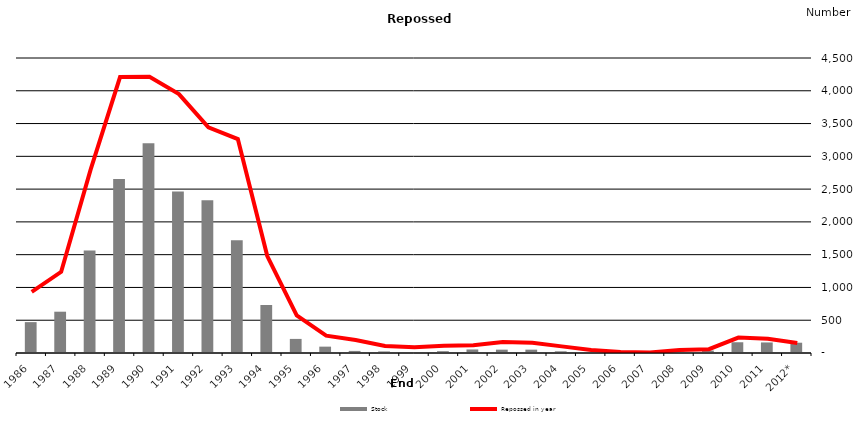
| Category | Stock |
|---|---|
| 1986  | 471 |
| 1987  | 630 |
| 1988  | 1562 |
| 1989  | 2654 |
| 1990  | 3201 |
| 1991  | 2463 |
| 1992  | 2331 |
| 1993  | 1720 |
| 1994  | 732 |
| 1995  | 215 |
| 1996  | 97 |
| 1997  | 32 |
| 1998  | 24 |
| 1999  | 15 |
| 2000  | 28 |
| 2001  | 54 |
| 2002  | 51 |
| 2003  | 51 |
| 2004  | 26 |
| 2005  | 13 |
| 2006  | 1 |
| 2007  | 4 |
| 2008  | 23 |
| 2009  | 37 |
| 2010  | 164 |
| 2011  | 161 |
| 2012* | 157 |